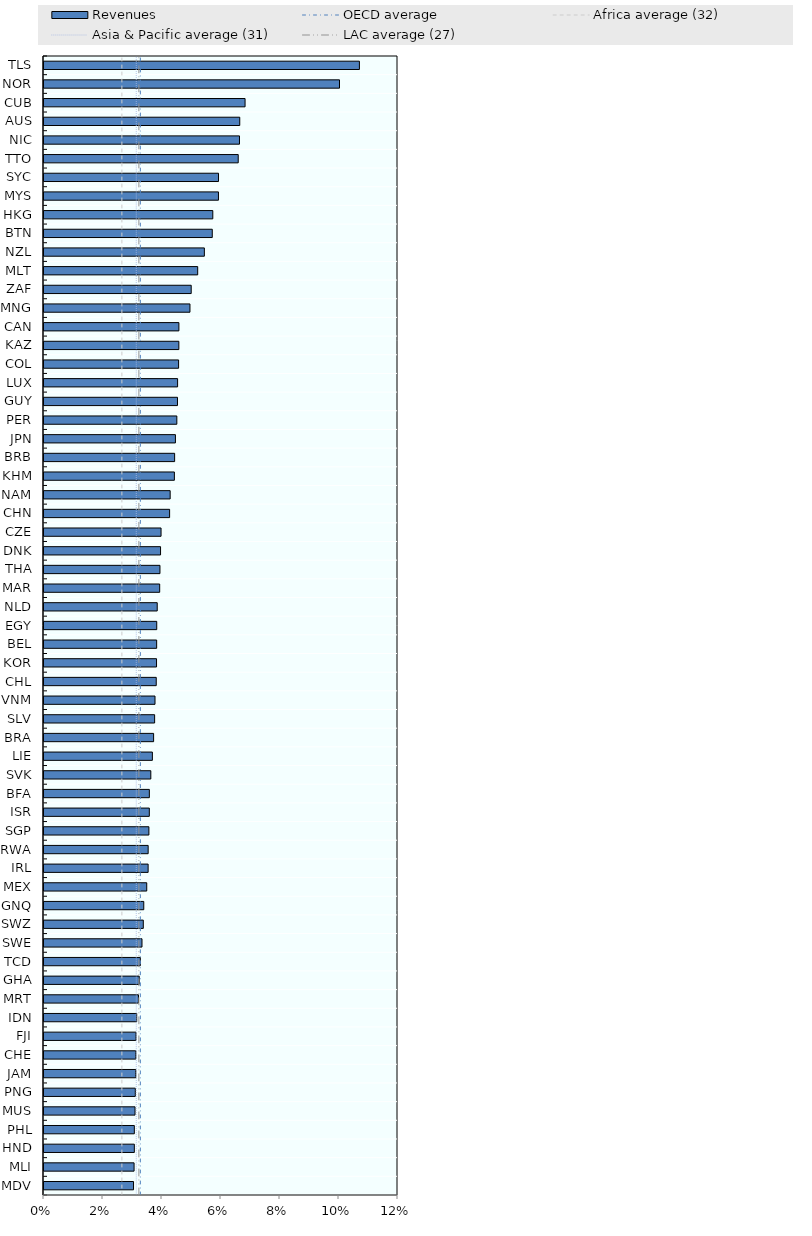
| Category | Revenues |
|---|---|
| MDV | 0.03 |
| MLI | 0.031 |
| HND | 0.031 |
| PHL | 0.031 |
| MUS | 0.031 |
| PNG | 0.031 |
| JAM | 0.031 |
| CHE | 0.031 |
| FJI | 0.031 |
| IDN | 0.031 |
| MRT | 0.032 |
| GHA | 0.032 |
| TCD | 0.033 |
| SWE | 0.033 |
| SWZ | 0.034 |
| GNQ | 0.034 |
| MEX | 0.035 |
| IRL | 0.035 |
| RWA | 0.035 |
| SGP | 0.036 |
| ISR | 0.036 |
| BFA | 0.036 |
| SVK | 0.036 |
| LIE | 0.037 |
| BRA | 0.037 |
| SLV | 0.038 |
| VNM | 0.038 |
| CHL | 0.038 |
| KOR | 0.038 |
| BEL | 0.038 |
| EGY | 0.038 |
| NLD | 0.038 |
| MAR | 0.039 |
| THA | 0.039 |
| DNK | 0.04 |
| CZE | 0.04 |
| CHN | 0.043 |
| NAM | 0.043 |
| KHM | 0.044 |
| BRB | 0.044 |
| JPN | 0.045 |
| PER | 0.045 |
| GUY | 0.045 |
| LUX | 0.045 |
| COL | 0.046 |
| KAZ | 0.046 |
| CAN | 0.046 |
| MNG | 0.049 |
| ZAF | 0.05 |
| MLT | 0.052 |
| NZL | 0.054 |
| BTN | 0.057 |
| HKG | 0.057 |
| MYS | 0.059 |
| SYC | 0.059 |
| TTO | 0.066 |
| NIC | 0.066 |
| AUS | 0.066 |
| CUB | 0.068 |
| NOR | 0.1 |
| TLS | 0.107 |